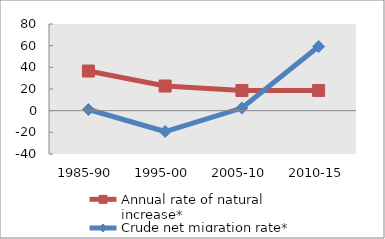
| Category | Annual rate of natural increase* | Crude net migration rate* |
|---|---|---|
| 1985-90 | 36.595 | 1.088 |
| 1995-00 | 22.744 | -19.253 |
| 2005-10 | 18.62 | 2.446 |
| 2010-15 | 18.682 | 59.187 |